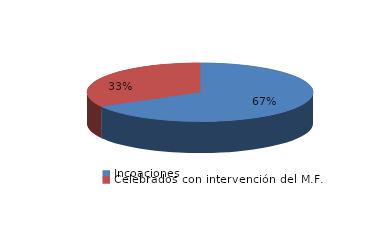
| Category | Series 0 |
|---|---|
| Incoaciones | 3558 |
| Celebrados con intervención del M.F. | 1769 |